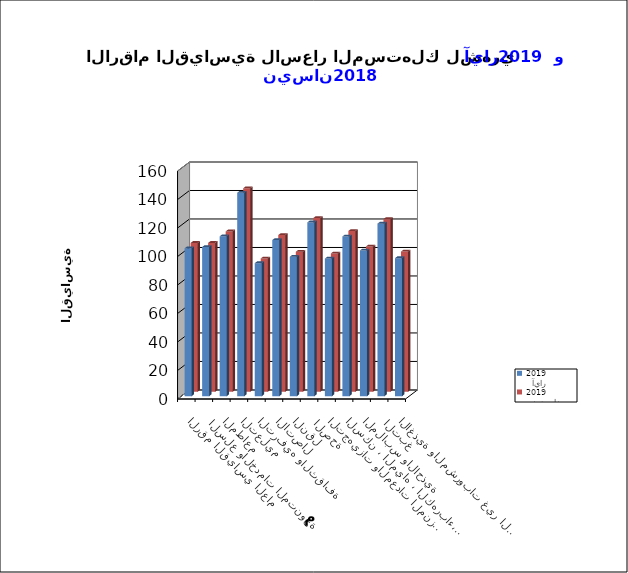
| Category |   آيار     2019      |   نيسان     2019      |
|---|---|---|
| الاغذية والمشروبات غير الكحولية | 96.9 | 98.3 |
|  التبغ | 121.1 | 121.1 |
| الملابس والاحذية | 102.3 | 101.9 |
| السكن ، المياه ، الكهرباء، الغاز  | 112.1 | 112.8 |
| التجهيزات والمعدات المنزلية والصيانة | 96.6 | 97 |
|  الصحة | 122 | 121.9 |
| النقل | 97.9 | 98.2 |
| الاتصال | 109.6 | 109.9 |
| الترفيه والثقافة | 93.4 | 93.5 |
| التعليم | 142.8 | 142.8 |
| المطاعم  | 112.2 | 112.5 |
|  السلع والخدمات المتنوعة | 104.7 | 104.4 |
| الرقم القياسي العام | 103.8 | 104.4 |